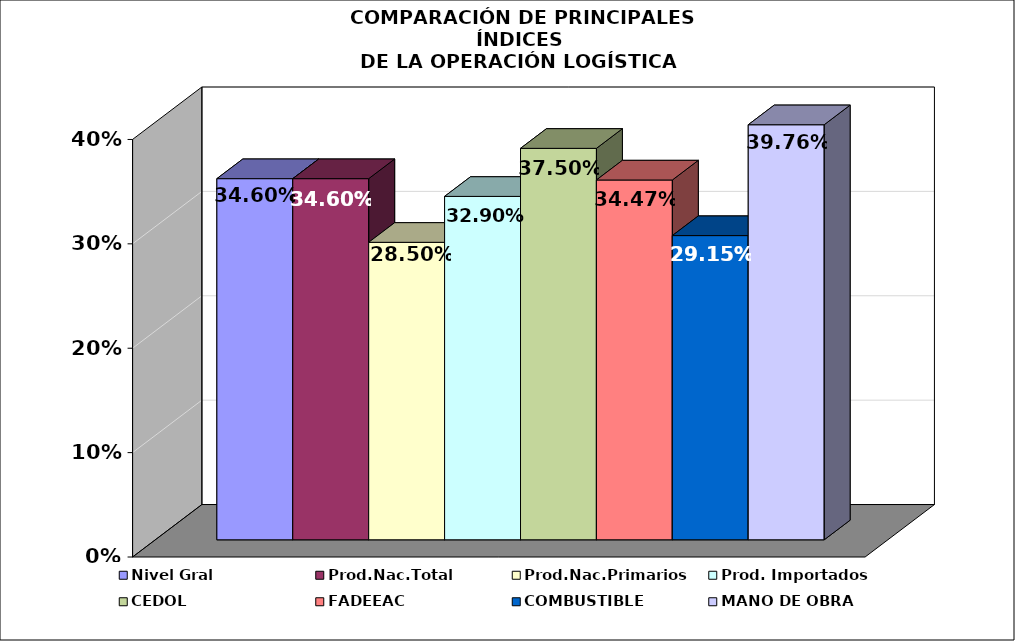
| Category | Nivel Gral | Prod.Nac.Total | Prod.Nac.Primarios | Prod. Importados | CEDOL | FADEEAC | COMBUSTIBLE | MANO DE OBRA |
|---|---|---|---|---|---|---|---|---|
| 0 | 0.346 | 0.346 | 0.285 | 0.329 | 0.375 | 0.345 | 0.291 | 0.398 |